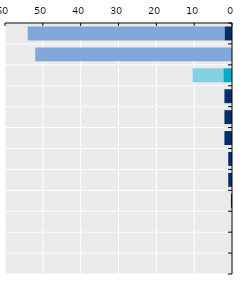
| Category | Series 0 | Father-specific parental and homecare leave |
|---|---|---|
| Korea | 2 | 52 |
| Japan | 0 | 52 |
| OECD average | 2.3 | 8.1 |
| Australia | 2 | 0 |
| Singapore | 2 | 0 |
| Mongolia | 2 | 0 |
| Viet Nam* | 1 | 0 |
| Malaysia* | 1 | 0 |
| Indonesia* | 0.286 | 0 |
| China | 0 | 0 |
| New Zealand | 0 | 0 |
| Thailand | 0 | 0 |